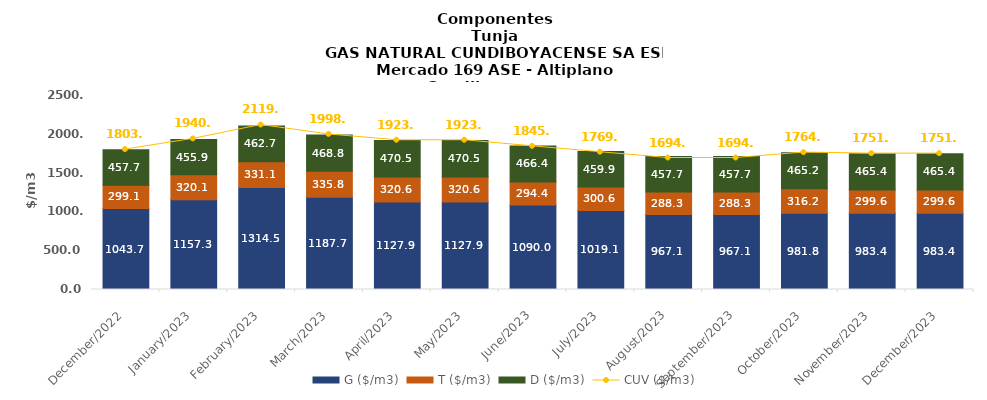
| Category | G ($/m3) | T ($/m3) | D ($/m3) |
|---|---|---|---|
| 2022-12-01 | 1043.68 | 299.05 | 457.65 |
| 2023-01-01 | 1157.27 | 320.12 | 455.93 |
| 2023-02-01 | 1314.49 | 331.09 | 462.69 |
| 2023-03-01 | 1187.7 | 335.79 | 468.75 |
| 2023-04-01 | 1127.9 | 320.55 | 470.54 |
| 2023-05-01 | 1127.9 | 320.55 | 470.54 |
| 2023-06-01 | 1090.01 | 294.4 | 466.35 |
| 2023-07-01 | 1019.05 | 300.55 | 459.92 |
| 2023-08-01 | 967.08 | 288.3 | 457.73 |
| 2023-09-01 | 967.08 | 288.3 | 457.72 |
| 2023-10-01 | 981.83 | 316.2 | 465.18 |
| 2023-11-01 | 983.39 | 299.62 | 465.37 |
| 2023-12-01 | 983.39 | 299.62 | 465.37 |